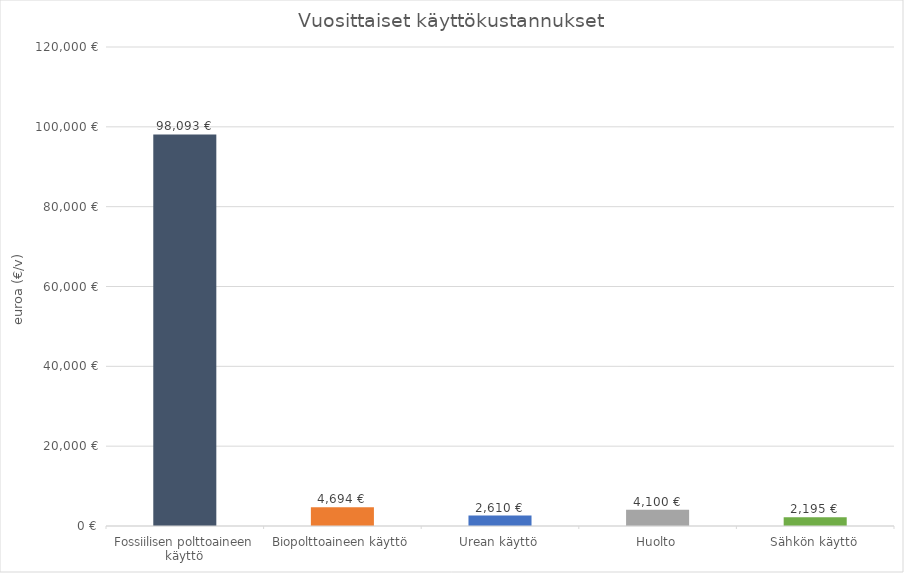
| Category | Vuosittaiset kustannukset |
|---|---|
| Fossiilisen polttoaineen käyttö | 98092.687 |
| Biopolttoaineen käyttö | 4693.92 |
| Urean käyttö | 2610 |
| Huolto | 4100 |
| Sähkön käyttö | 2194.8 |